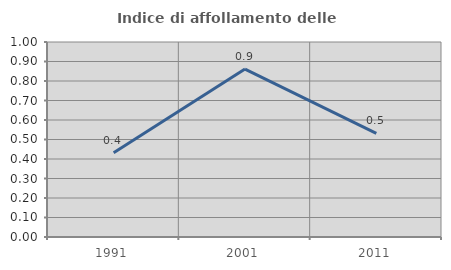
| Category | Indice di affollamento delle abitazioni  |
|---|---|
| 1991.0 | 0.432 |
| 2001.0 | 0.861 |
| 2011.0 | 0.531 |